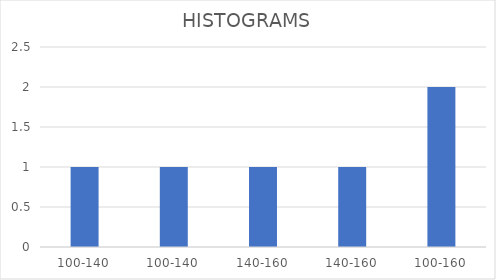
| Category | Series 0 |
|---|---|
| 100-140 | 1 |
| 100-140 | 1 |
| 140-160 | 1 |
| 140-160 | 1 |
| 100-160 | 2 |